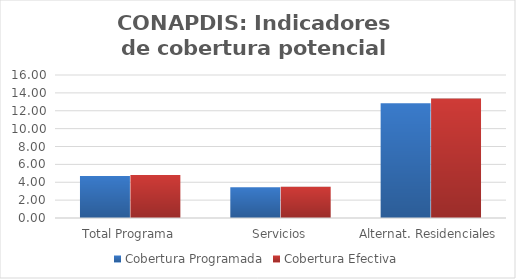
| Category | Cobertura Programada | Cobertura Efectiva |
|---|---|---|
| Total Programa | 4.687 | 4.802 |
| Servicios | 3.436 | 3.487 |
| Alternat. Residenciales | 12.829 | 13.364 |